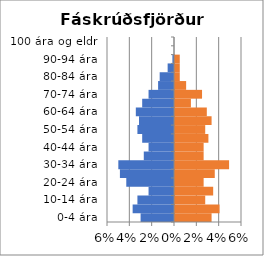
| Category | % karlar | %konur |
|---|---|---|
| 0-4 ára | -0.03 | 0.033 |
| 5-9 ára | -0.037 | 0.04 |
| 10-14 ára | -0.033 | 0.027 |
| 15-19 ára | -0.023 | 0.034 |
| 20-24 ára | -0.043 | 0.026 |
| 25-29 ára | -0.048 | 0.036 |
| 30-34 ára | -0.05 | 0.048 |
| 35-39 ára | -0.027 | 0.026 |
| 40-44 ára | -0.023 | 0.026 |
| 45-49 ára | -0.028 | 0.03 |
| 50-54 ára | -0.033 | 0.027 |
| 55-59 ára | -0.031 | 0.033 |
| 60-64 ára | -0.034 | 0.028 |
| 65-69 ára | -0.028 | 0.014 |
| 70-74 ára | -0.023 | 0.024 |
| 75-79 ára | -0.014 | 0.01 |
| 80-84 ára | -0.013 | 0.004 |
| 85-89 ára | -0.006 | 0.004 |
| 90-94 ára | -0.001 | 0.004 |
| 95-99 ára | 0 | 0 |
| 100 ára og eldri | 0 | 0 |